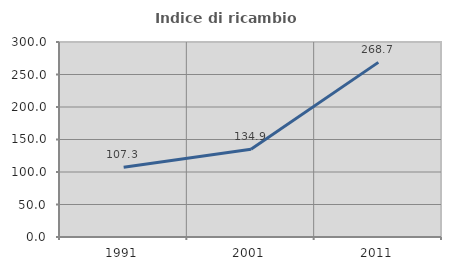
| Category | Indice di ricambio occupazionale  |
|---|---|
| 1991.0 | 107.283 |
| 2001.0 | 134.9 |
| 2011.0 | 268.661 |